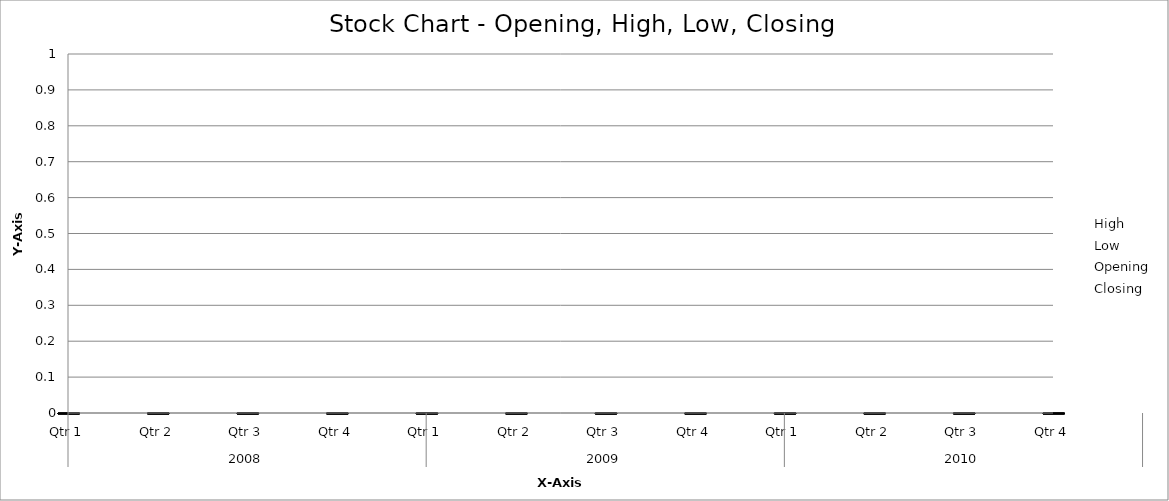
| Category | High | Low | Opening | Closing |
|---|---|---|---|---|
| 0 | 163 | 85 | 131 | 134 |
| 1 | 191 | 87 | 134 | 133 |
| 2 | 201 | 105 | 133 | 105 |
| 3 | 191 | 85 | 105 | 169 |
| 4 | 278 | 147 | 169 | 269 |
| 5 | 304 | 248 | 269 | 258 |
| 6 | 310 | 209 | 258 | 209 |
| 7 | 320 | 159 | 209 | 310 |
| 8 | 387 | 264 | 310 | 325 |
| 9 | 376 | 298 | 325 | 329 |
| 10 | 391 | 282 | 329 | 347 |
| 11 | 432 | 324 | 347 | 427 |